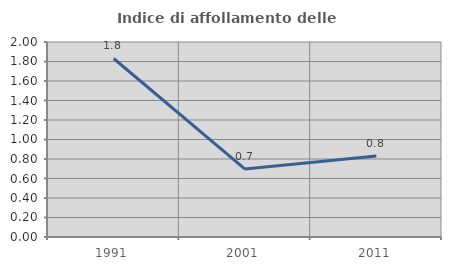
| Category | Indice di affollamento delle abitazioni  |
|---|---|
| 1991.0 | 1.831 |
| 2001.0 | 0.697 |
| 2011.0 | 0.831 |